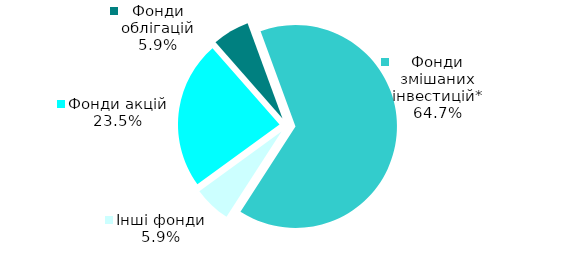
| Category | Series 0 |
|---|---|
| Фонди акцій | 8 |
| Фонди облігацій | 2 |
| Фонди змішаних інвестицій* | 22 |
| Інші фонди | 2 |